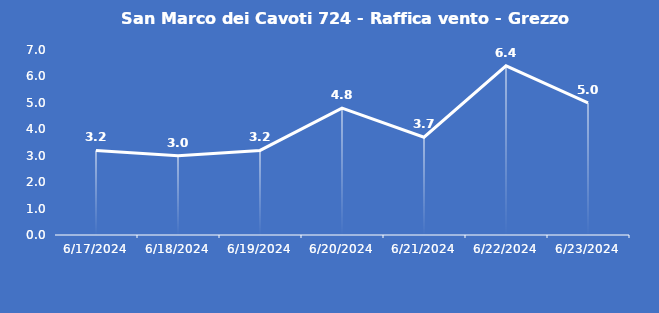
| Category | San Marco dei Cavoti 724 - Raffica vento - Grezzo (m/s) |
|---|---|
| 6/17/24 | 3.2 |
| 6/18/24 | 3 |
| 6/19/24 | 3.2 |
| 6/20/24 | 4.8 |
| 6/21/24 | 3.7 |
| 6/22/24 | 6.4 |
| 6/23/24 | 5 |